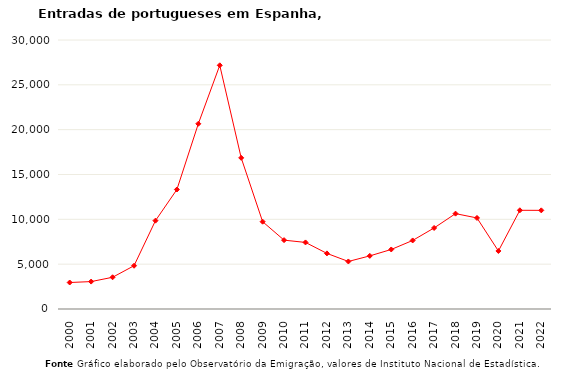
| Category | Entradas |
|---|---|
| 2000.0 | 2955 |
| 2001.0 | 3057 |
| 2002.0 | 3538 |
| 2003.0 | 4825 |
| 2004.0 | 9851 |
| 2005.0 | 13327 |
| 2006.0 | 20658 |
| 2007.0 | 27178 |
| 2008.0 | 16857 |
| 2009.0 | 9739 |
| 2010.0 | 7678 |
| 2011.0 | 7424 |
| 2012.0 | 6201 |
| 2013.0 | 5302 |
| 2014.0 | 5923 |
| 2015.0 | 6638 |
| 2016.0 | 7646 |
| 2017.0 | 9038 |
| 2018.0 | 10636 |
| 2019.0 | 10155 |
| 2020.0 | 6471 |
| 2021.0 | 11009 |
| 2022.0 | 11001 |